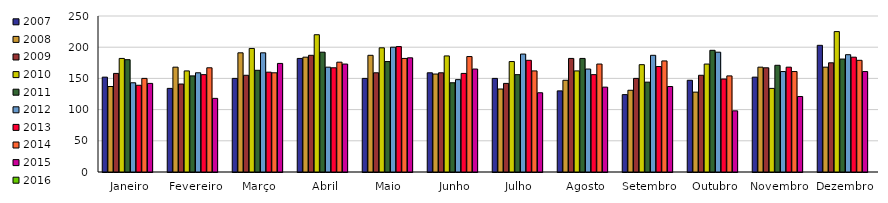
| Category | 2007 | 2008 | 2009 | 2010 | 2011 | 2012 | 2013 | 2014 | 2015 | 2016 |
|---|---|---|---|---|---|---|---|---|---|---|
| Janeiro | 152 | 137 | 158 | 182 | 180 | 143 | 139 | 150 | 142 |  |
| Fevereiro | 134 | 168 | 141 | 162 | 154 | 159 | 156 | 167 | 118 |  |
| Março | 150 | 191 | 155 | 198 | 163 | 191 | 160 | 159 | 174 |  |
| Abril | 182 | 184 | 187 | 220 | 192 | 168 | 167 | 176 | 173 |  |
| Maio | 150 | 187 | 159 | 199 | 177 | 200 | 201 | 182 | 183 |  |
| Junho | 159 | 157 | 159 | 186 | 143 | 148 | 158 | 185 | 165 |  |
| Julho | 150 | 133 | 142 | 177 | 156 | 189 | 179 | 162 | 127 |  |
| Agosto | 130 | 147 | 182 | 162 | 182 | 165 | 156 | 173 | 136 |  |
| Setembro | 124 | 131 | 150 | 172 | 144 | 187 | 169 | 178 | 137 |  |
| Outubro | 147 | 128 | 155 | 173 | 195 | 192 | 149 | 154 | 98 |  |
| Novembro | 152 | 168 | 167 | 134 | 171 | 161 | 168 | 161 | 121 |  |
| Dezembro | 203 | 168 | 175 | 225 | 181 | 188 | 184 | 179 | 161 |  |